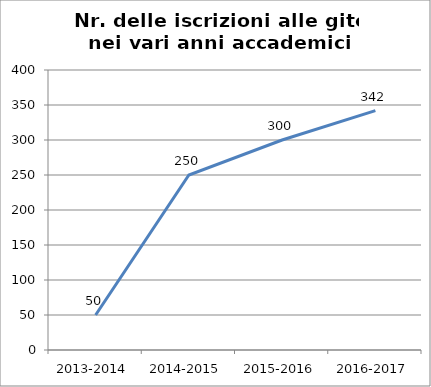
| Category | Nr. Iscrizioni alle Gite |
|---|---|
| 2013-2014 | 50 |
| 2014-2015 | 250 |
| 2015-2016 | 300 |
| 2016-2017 | 342 |